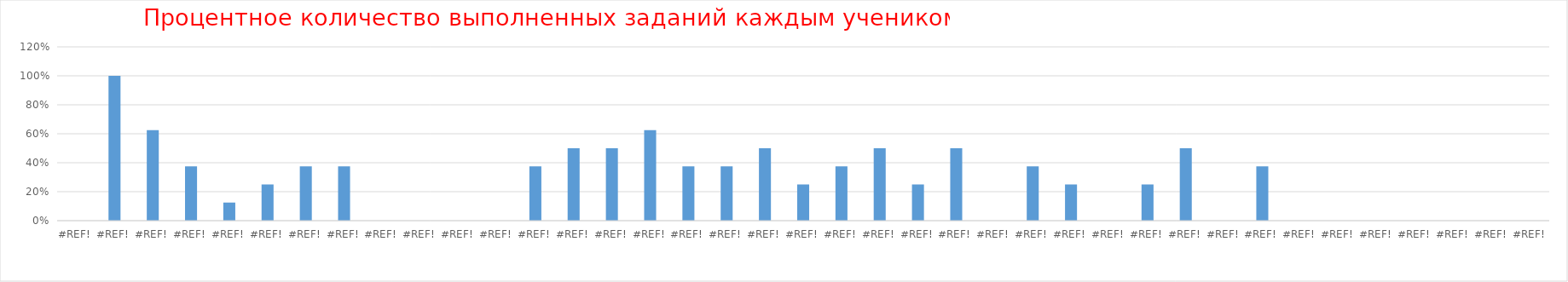
| Category | Series 0 |
|---|---|
| 0.0 | 0 |
| 0.0 | 1 |
| 0.0 | 0.625 |
| 0.0 | 0.375 |
| 0.0 | 0.125 |
| 0.0 | 0.25 |
| 0.0 | 0.375 |
| 0.0 | 0.375 |
| 0.0 | 0 |
| 0.0 | 0 |
| 0.0 | 0 |
| 0.0 | 0 |
| 0.0 | 0.375 |
| 0.0 | 0.5 |
| 0.0 | 0.5 |
| 0.0 | 0.625 |
| 0.0 | 0.375 |
| 0.0 | 0.375 |
| 0.0 | 0.5 |
| 0.0 | 0.25 |
| 0.0 | 0.375 |
| 0.0 | 0.5 |
| 0.0 | 0.25 |
| 0.0 | 0.5 |
| 0.0 | 0 |
| 0.0 | 0.375 |
| 0.0 | 0.25 |
| 0.0 | 0 |
| 0.0 | 0.25 |
| 0.0 | 0.5 |
| 0.0 | 0 |
| 0.0 | 0.375 |
| 0.0 | 0 |
| 0.0 | 0 |
| 0.0 | 0 |
| 0.0 | 0 |
| 0.0 | 0 |
| 0.0 | 0 |
| 0.0 | 0 |